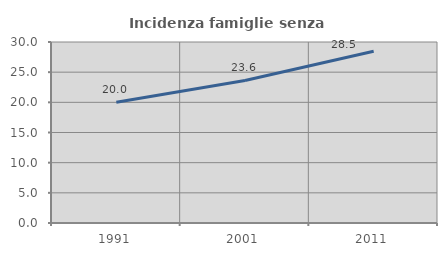
| Category | Incidenza famiglie senza nuclei |
|---|---|
| 1991.0 | 20.022 |
| 2001.0 | 23.629 |
| 2011.0 | 28.465 |